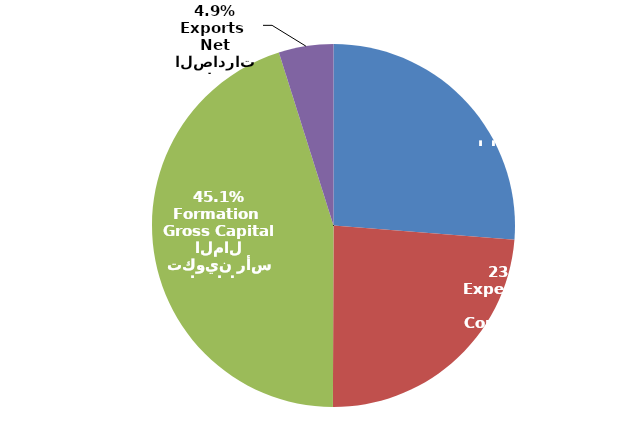
| Category | Series 0 |
|---|---|
| الإنفاق الاستهلاكي النهائي للأسر المعيشية
Household Final Consumption Expenditure | 33555.414 |
| الإنفاق الاستهلاكي النهائي للحكومة
Government Final Consumption Expenditure | 30430.619 |
| إجمالي تكوين رأس المال
Gross Capital Formation  | 57634.913 |
| صافي الصادرات
Net Exports  | 6221 |